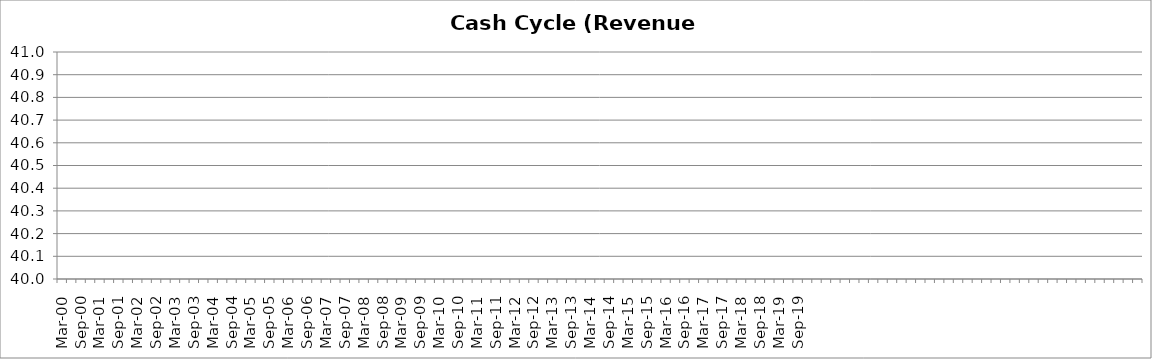
| Category | Series 0 |
|---|---|
| Mar-00 | 29.129 |
| Jun-00 | 28.718 |
| Sep-00 | 31.562 |
| Dec-00 | 29.197 |
| Mar-01 | 34.53 |
| Jun-01 | 35.55 |
| Sep-01 | 37.813 |
| Dec-01 | 32.187 |
| Mar-02 | 29.383 |
| Jun-02 | 24.161 |
| Sep-02 | 27.43 |
| Dec-02 | 29.179 |
| Mar-03 | 21.872 |
| Jun-03 | 22.578 |
| Sep-03 | 24.532 |
| Dec-03 | 26.603 |
| Mar-04 | 17.831 |
| Jun-04 | 22.602 |
| Sep-04 | 23.382 |
| Dec-04 | 26.07 |
| Mar-05 | 19.271 |
| Jun-05 | 21.281 |
| Sep-05 | 19.099 |
| Dec-05 | 20.236 |
| Mar-06 | 16.529 |
| Jun-06 | 16.322 |
| Sep-06 | 19.91 |
| Dec-06 | 20.78 |
| Mar-07 | 14.186 |
| Jun-07 | 16.651 |
| Sep-07 | 18.1 |
| Dec-07 | 24.561 |
| Mar-08 | 17.575 |
| Jun-08 | 18.405 |
| Sep-08 | 19.659 |
| Dec-08 | 22.391 |
| Mar-09 | 20.995 |
| Jun-09 | 21.844 |
| Sep-09 | 15.879 |
| Dec-09 | 22.527 |
| Mar-10 | 19.991 |
| Jun-10 | 18.01 |
| Sep-10 | 20.953 |
| Dec-10 | 21.08 |
| Mar-11 | 19.028 |
| Jun-11 | 16.044 |
| Sep-11 | 18.691 |
| Dec-11 | 23.938 |
| Mar-12 | 19.846 |
| Jun-12 | 18.383 |
| Sep-12 | 19.9 |
| Dec-12 | 20.033 |
| Mar-13 | 19.775 |
| Jun-13 | 18.362 |
| Sep-13 | 22.398 |
| Dec-13 | 18.288 |
| Mar-14 | 18.761 |
| Jun-14 | 16.986 |
| Sep-14 | 17.161 |
| Dec-14 | 21.774 |
| Mar-15 | 19.474 |
| Jun-15 | 18.584 |
| Sep-15 | 16.936 |
| Dec-15 | 19.961 |
| Mar-16 | 20.457 |
| Jun-16 | 19.623 |
| Sep-16 | 19.183 |
| Dec-16 | 19.973 |
| Mar-17 | 22.275 |
| Jun-17 | 13.991 |
| Sep-17 | 17.55 |
| Dec-17 | 16.424 |
| Mar-18 | 20.725 |
| Jun-18 | 28.335 |
| Sep-18 | 17.313 |
| Dec-18 | 23.721 |
| Mar-19 | 18.168 |
| Jun-19 | 8.89 |
| Sep-19 | 15.776 |